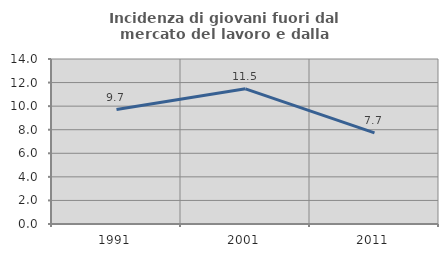
| Category | Incidenza di giovani fuori dal mercato del lavoro e dalla formazione  |
|---|---|
| 1991.0 | 9.707 |
| 2001.0 | 11.472 |
| 2011.0 | 7.732 |